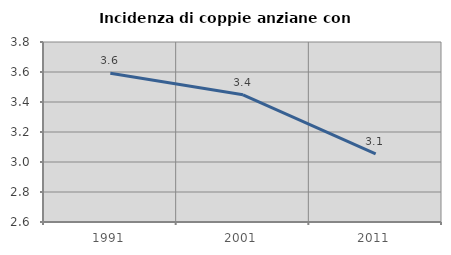
| Category | Incidenza di coppie anziane con figli |
|---|---|
| 1991.0 | 3.591 |
| 2001.0 | 3.448 |
| 2011.0 | 3.053 |